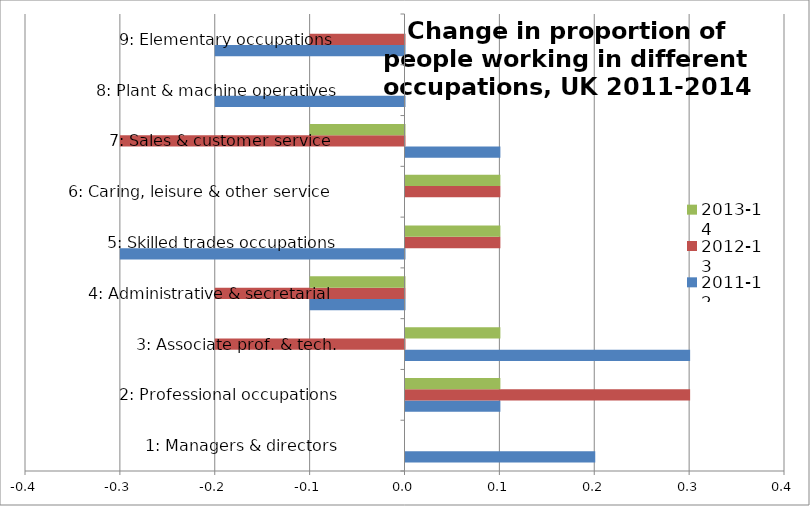
| Category | 2011-12 | 2012-13 | 2013-14 |
|---|---|---|---|
| 1: Managers & directors | 0.2 | 0 | 0 |
| 2: Professional occupations | 0.1 | 0.3 | 0.1 |
| 3: Associate prof. & tech. | 0.3 | -0.2 | 0.1 |
| 4: Administrative & secretarial  | -0.1 | -0.2 | -0.1 |
| 5: Skilled trades occupations | -0.3 | 0.1 | 0.1 |
| 6: Caring, leisure & other service  | 0 | 0.1 | 0.1 |
| 7: Sales & customer service  | 0.1 | -0.3 | -0.1 |
| 8: Plant & machine operatives | -0.2 | 0 | 0 |
| 9: Elementary occupations  | -0.2 | -0.1 | 0 |